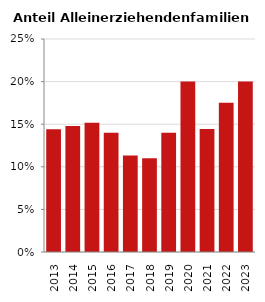
| Category | Anteil Alleinerziehende an Familien |
|---|---|
| 2013.0 | 0.144 |
| 2014.0 | 0.148 |
| 2015.0 | 0.152 |
| 2016.0 | 0.14 |
| 2017.0 | 0.113 |
| 2018.0 | 0.11 |
| 2019.0 | 0.14 |
| 2020.0 | 0.2 |
| 2021.0 | 0.144 |
| 2022.0 | 0.175 |
| 2023.0 | 0.2 |